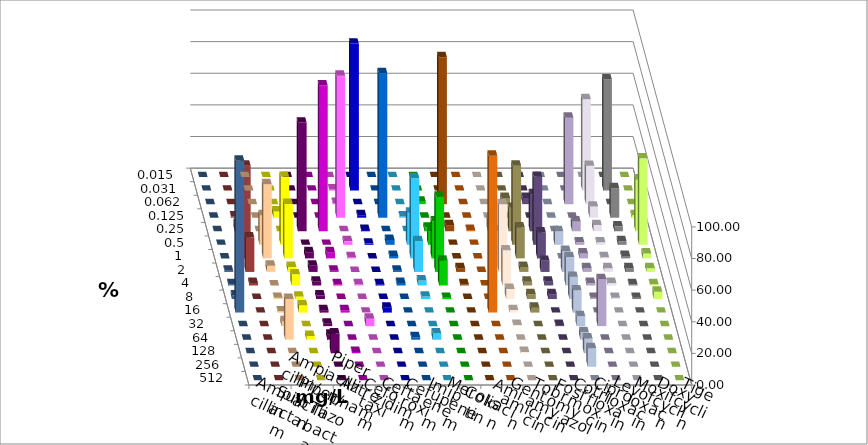
| Category | Ampicillin | Ampicillin/ Sulbactam | Piperacillin | Piperacillin/ Tazobactam | Aztreonam | Cefotaxim | Ceftazidim | Cefuroxim | Imipenem | Meropenem | Colistin | Amikacin | Gentamicin | Tobramycin | Fosfomycin | Cotrimoxazol | Ciprofloxacin | Levofloxacin | Moxifloxacin | Doxycyclin | Tigecyclin |
|---|---|---|---|---|---|---|---|---|---|---|---|---|---|---|---|---|---|---|---|---|---|
| 0.015 | 0 | 0 | 0 | 0 | 0 | 0 | 0 | 0 | 0 | 0 | 0 | 0 | 0 | 0 | 0 | 0 | 0 | 0 | 0 | 0 | 0 |
| 0.031 | 0 | 0 | 0 | 0 | 0.781 | 92.969 | 0 | 0 | 0 | 0 | 0 | 0 | 0 | 0 | 0 | 0 | 57.812 | 70.312 | 0 | 0 | 0 |
| 0.062 | 0 | 0 | 0 | 0 | 0.781 | 0 | 0 | 0 | 1.562 | 92.969 | 0 | 0 | 3.906 | 3.906 | 0 | 54.688 | 24.219 | 0 | 0 | 0 | 0 |
| 0.125 | 0 | 3.906 | 0 | 0 | 89.844 | 1.562 | 91.406 | 0.781 | 0 | 0 | 0 | 0 | 0 | 0 | 0 | 0 | 7.031 | 18.75 | 1.562 | 0 | 0.781 |
| 0.25 | 0 | 0 | 68.75 | 92.188 | 0 | 0.781 | 0 | 0 | 2.344 | 3.906 | 0.781 | 7.937 | 14.844 | 23.438 | 0 | 6.25 | 3.906 | 3.125 | 32.812 | 0 | 4.688 |
| 0.5 | 18.75 | 42.969 | 0 | 0 | 2.344 | 0.781 | 3.125 | 20.312 | 8.594 | 0 | 0 | 0 | 50 | 42.969 | 8.594 | 1.562 | 1.562 | 2.344 | 54.688 | 0 | 12.5 |
| 1.0 | 46.875 | 34.375 | 3.906 | 3.906 | 0.781 | 0 | 1.562 | 50.781 | 23.438 | 0 | 0 | 17.46 | 19.531 | 16.406 | 0 | 3.125 | 0.781 | 1.562 | 3.125 | 0 | 58.594 |
| 2.0 | 3.906 | 3.125 | 3.906 | 0.781 | 0 | 0 | 0.781 | 19.531 | 47.656 | 2.344 | 0 | 42.857 | 3.125 | 7.031 | 13.281 | 2.344 | 2.344 | 2.344 | 2.344 | 0.781 | 21.875 |
| 4.0 | 0 | 7.031 | 2.344 | 0.781 | 0.781 | 0.781 | 1.562 | 3.125 | 15.625 | 0.781 | 0 | 22.222 | 2.344 | 2.344 | 17.969 | 1.562 | 1.562 | 0.781 | 0.781 | 0.781 | 1.562 |
| 8.0 | 0.781 | 1.562 | 2.344 | 0 | 0 | 0 | 0 | 1.562 | 0.781 | 0 | 0 | 6.349 | 3.125 | 3.125 | 14.062 | 0.781 | 0.781 | 0.781 | 4.688 | 2.344 | 0 |
| 16.0 | 0.781 | 4.688 | 1.562 | 1.562 | 0 | 3.125 | 0 | 0 | 0 | 0 | 99.219 | 1.587 | 3.125 | 0 | 14.062 | 0 | 0 | 0 | 0 | 96.094 | 0 |
| 32.0 | 3.125 | 0 | 1.562 | 0 | 4.688 | 0 | 0 | 0 | 0 | 0 | 0 | 0.794 | 0 | 0.781 | 6.25 | 29.688 | 0 | 0 | 0 | 0 | 0 |
| 64.0 | 25.781 | 2.344 | 3.125 | 0 | 0 | 0 | 1.562 | 3.906 | 0 | 0 | 0 | 0 | 0 | 0 | 4.688 | 0 | 0 | 0 | 0 | 0 | 0 |
| 128.0 | 0 | 0 | 12.5 | 0.781 | 0 | 0 | 0 | 0 | 0 | 0 | 0 | 0.794 | 0 | 0 | 9.375 | 0 | 0 | 0 | 0 | 0 | 0 |
| 256.0 | 0 | 0 | 0 | 0 | 0 | 0 | 0 | 0 | 0 | 0 | 0 | 0 | 0 | 0 | 11.719 | 0 | 0 | 0 | 0 | 0 | 0 |
| 512.0 | 0 | 0 | 0 | 0 | 0 | 0 | 0 | 0 | 0 | 0 | 0 | 0 | 0 | 0 | 0 | 0 | 0 | 0 | 0 | 0 | 0 |